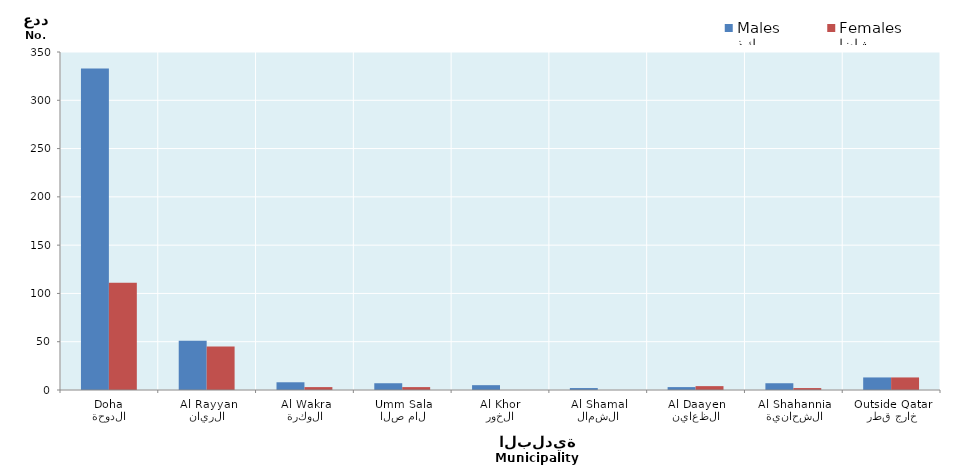
| Category | ذكور
Males | إناث
Females |
|---|---|---|
| الدوحة
Doha | 333 | 111 |
| الريان
Al Rayyan | 51 | 45 |
| الوكرة
Al Wakra | 8 | 3 |
| ام صلال
Umm Salal | 7 | 3 |
| الخور
Al Khor | 5 | 0 |
| الشمال
Al Shamal | 2 | 0 |
| الظعاين
Al Daayen | 3 | 4 |
| الشحانية
Al Shahannia | 7 | 2 |
| خارج قطر
Outside Qatar | 13 | 13 |